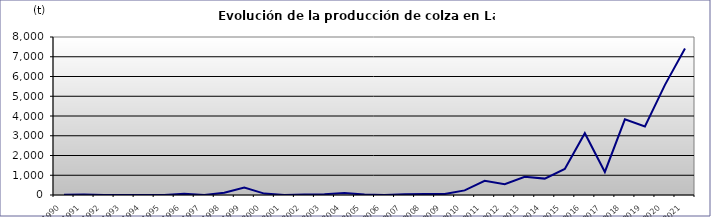
| Category | PRODUCCIÓN  (t) |
|---|---|
| 1990.0 | 15 |
| 1991.0 | 20 |
| 1992.0 | 6 |
| 1993.0 | 0 |
| 1994.0 | 0 |
| 1995.0 | 0 |
| 1996.0 | 65 |
| 1997.0 | 0 |
| 1998.0 | 118.4 |
| 1999.0 | 380.5 |
| 2000.0 | 71.8 |
| 2001.0 | 6.08 |
| 2002.0 | 31 |
| 2003.0 | 41 |
| 2004.0 | 95 |
| 2005.0 | 21 |
| 2006.0 | 0 |
| 2007.0 | 33 |
| 2008.0 | 56 |
| 2009.0 | 47 |
| 2010.0 | 235 |
| 2011.0 | 715 |
| 2012.0 | 545 |
| 2013.0 | 924 |
| 2014.0 | 830 |
| 2015.0 | 1317 |
| 2016.0 | 3129 |
| 2017.0 | 1166 |
| 2018.0 | 3834 |
| 2019.0 | 3473 |
| 2020.0 | 5576 |
| 2021.0 | 7413 |